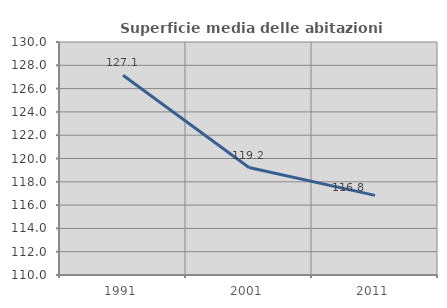
| Category | Superficie media delle abitazioni occupate |
|---|---|
| 1991.0 | 127.149 |
| 2001.0 | 119.224 |
| 2011.0 | 116.835 |